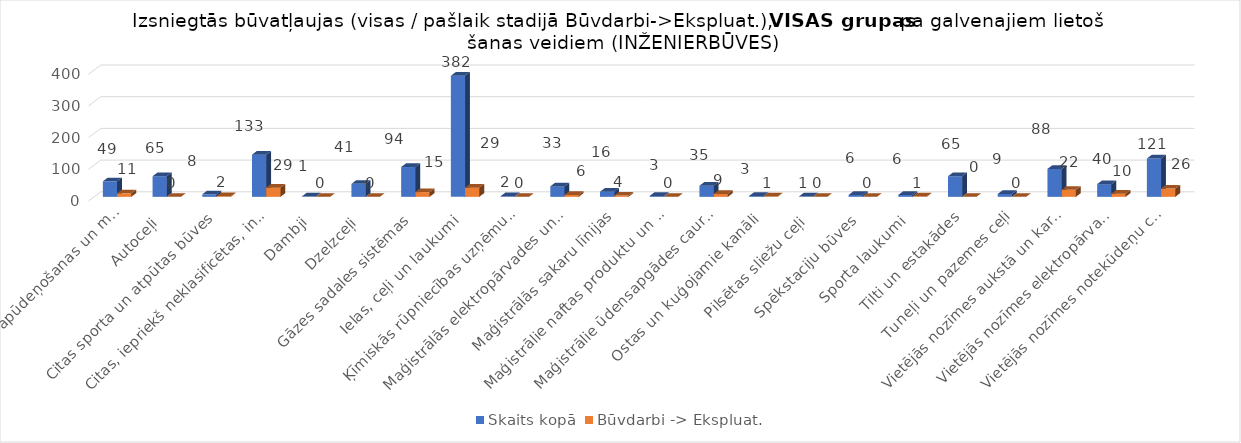
| Category | Skaits kopā | Būvdarbi -> Ekspluat. |
|---|---|---|
| Akvedukti, apūdeņošanas un meliorācijas hidrobūves | 49 | 11 |
| Autoceļi | 65 | 0 |
| Citas sporta un atpūtas būves | 8 | 2 |
| Citas, iepriekš neklasificētas, inženierbūves | 133 | 29 |
| Dambji | 1 | 0 |
| Dzelzceļi | 41 | 0 |
| Gāzes sadales sistēmas | 94 | 15 |
| Ielas, ceļi un laukumi | 382 | 29 |
| Ķīmiskās rūpniecības uzņēmumu būves | 2 | 0 |
| Maģistrālās elektropārvades un elektrosadales līnijas | 33 | 6 |
| Maģistrālās sakaru līnijas | 16 | 4 |
| Maģistrālie naftas produktu un gāzes cauruļvadi | 3 | 0 |
| Maģistrālie ūdensapgādes cauruļvadi | 35 | 9 |
| Ostas un kuģojamie kanāli | 3 | 1 |
| Pilsētas sliežu ceļi | 1 | 0 |
| Spēkstaciju būves | 6 | 0 |
| Sporta laukumi | 6 | 1 |
| Tilti un estakādes | 65 | 0 |
| Tuneļi un pazemes ceļi | 9 | 0 |
| Vietējās nozīmes aukstā un karstā ūdens apgādes būves | 88 | 22 |
| Vietējās nozīmes elektropārvades un sakaru kabeļu būves | 40 | 10 |
| Vietējās nozīmes notekūdeņu cauruļvadi un attīrīšanas būves | 121 | 26 |